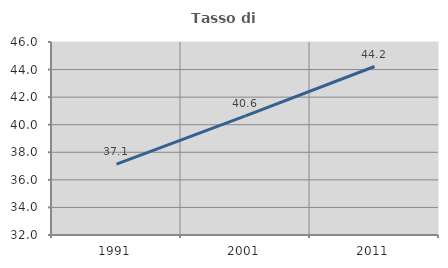
| Category | Tasso di occupazione   |
|---|---|
| 1991.0 | 37.135 |
| 2001.0 | 40.635 |
| 2011.0 | 44.222 |